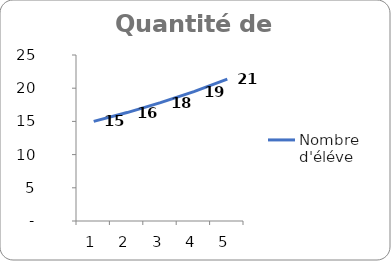
| Category | Nombre d'éléve |
|---|---|
| 0 | 15 |
| 1 | 16.33 |
| 2 | 17.818 |
| 3 | 19.485 |
| 4 | 21.354 |